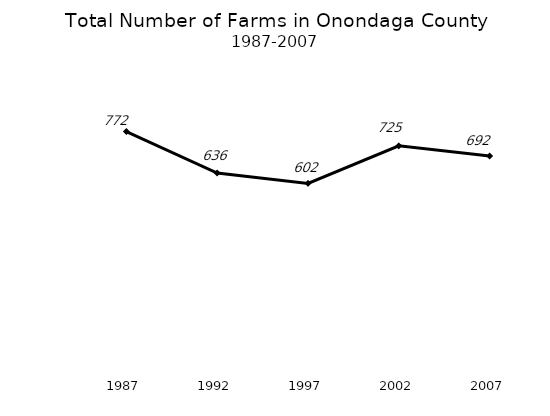
| Category | Number Farms  |
|---|---|
| 1987.0 | 772 |
| 1992.0 | 636 |
| 1997.0 | 602 |
| 2002.0 | 725 |
| 2007.0 | 692 |